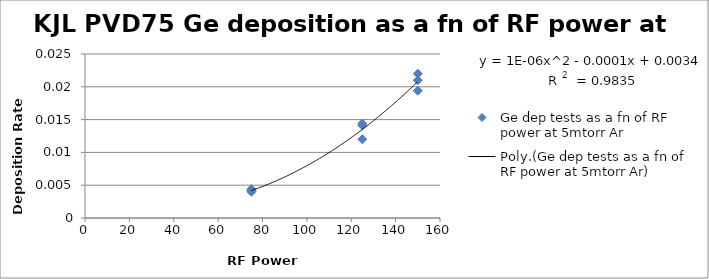
| Category | Ge dep tests as a fn of RF power at 5mtorr Ar |
|---|---|
| 75.0 | 0.004 |
| 75.0 | 0.004 |
| 75.0 | 0.004 |
| 125.0 | 0.014 |
| 125.0 | 0.012 |
| 125.0 | 0.014 |
| 150.0 | 0.022 |
| 150.0 | 0.021 |
| 150.0 | 0.019 |